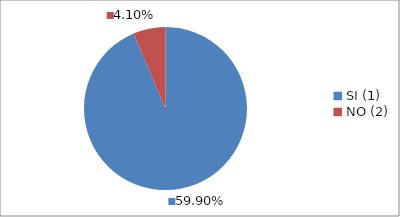
| Category | Series 0 |
|---|---|
| SI (1) | 0.599 |
| NO (2) | 0.041 |